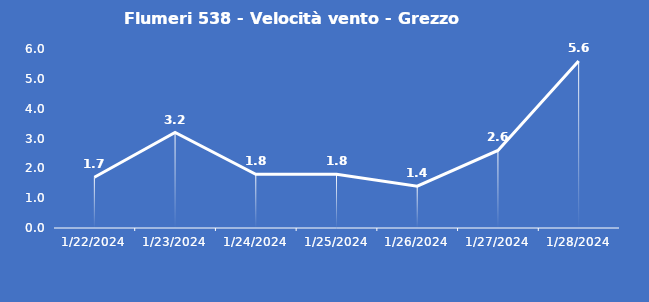
| Category | Flumeri 538 - Velocità vento - Grezzo (m/s) |
|---|---|
| 1/22/24 | 1.7 |
| 1/23/24 | 3.2 |
| 1/24/24 | 1.8 |
| 1/25/24 | 1.8 |
| 1/26/24 | 1.4 |
| 1/27/24 | 2.6 |
| 1/28/24 | 5.6 |